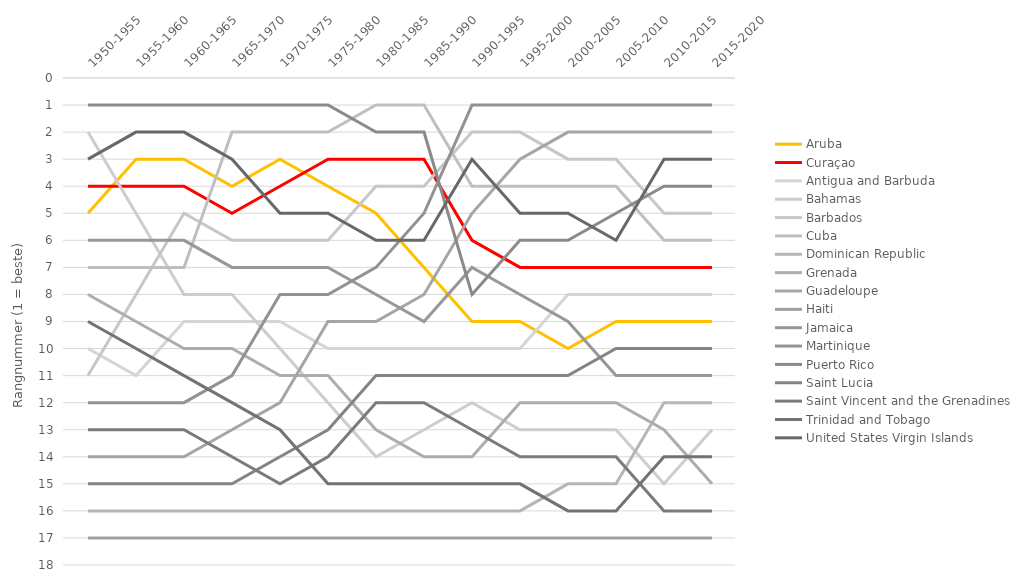
| Category | Aruba | Curaçao | Antigua and Barbuda | Bahamas | Barbados | Cuba | Dominican Republic | Grenada | Guadeloupe | Haiti | Jamaica | Martinique | Puerto Rico | Saint Lucia | Saint Vincent and the Grenadines | Trinidad and Tobago | United States Virgin Islands |
|---|---|---|---|---|---|---|---|---|---|---|---|---|---|---|---|---|---|
| 1950-1955 | 5 | 4 | 10 | 2 | 11 | 7 | 16 | 8 | 14 | 17 | 6 | 12 | 1 | 15 | 13 | 9 | 3 |
| 1955-1960 | 3 | 4 | 11 | 5 | 8 | 7 | 16 | 9 | 14 | 17 | 6 | 12 | 1 | 15 | 13 | 10 | 2 |
| 1960-1965 | 3 | 4 | 9 | 8 | 5 | 7 | 16 | 10 | 14 | 17 | 6 | 12 | 1 | 15 | 13 | 11 | 2 |
| 1965-1970 | 4 | 5 | 9 | 8 | 6 | 2 | 16 | 10 | 13 | 17 | 7 | 11 | 1 | 15 | 14 | 12 | 3 |
| 1970-1975 | 3 | 4 | 9 | 10 | 6 | 2 | 16 | 11 | 12 | 17 | 7 | 8 | 1 | 14 | 15 | 13 | 5 |
| 1975-1980 | 4 | 3 | 10 | 12 | 6 | 2 | 16 | 11 | 9 | 17 | 7 | 8 | 1 | 13 | 14 | 15 | 5 |
| 1980-1985 | 5 | 3 | 10 | 14 | 4 | 1 | 16 | 13 | 9 | 17 | 8 | 7 | 2 | 11 | 12 | 15 | 6 |
| 1985-1990 | 7 | 3 | 10 | 13 | 4 | 1 | 16 | 14 | 8 | 17 | 9 | 5 | 2 | 11 | 12 | 15 | 6 |
| 1990-1995 | 9 | 6 | 10 | 12 | 2 | 4 | 16 | 14 | 5 | 17 | 7 | 1 | 8 | 11 | 13 | 15 | 3 |
| 1995-2000 | 9 | 7 | 10 | 13 | 2 | 4 | 16 | 12 | 3 | 17 | 8 | 1 | 6 | 11 | 14 | 15 | 5 |
| 2000-2005 | 10 | 7 | 8 | 13 | 3 | 4 | 15 | 12 | 2 | 17 | 9 | 1 | 6 | 11 | 14 | 16 | 5 |
| 2005-2010 | 9 | 7 | 8 | 13 | 3 | 4 | 15 | 12 | 2 | 17 | 11 | 1 | 5 | 10 | 14 | 16 | 6 |
| 2010-2015 | 9 | 7 | 8 | 15 | 5 | 6 | 12 | 13 | 2 | 17 | 11 | 1 | 4 | 10 | 16 | 14 | 3 |
| 2015-2020 | 9 | 7 | 8 | 13 | 5 | 6 | 12 | 15 | 2 | 17 | 11 | 1 | 4 | 10 | 16 | 14 | 3 |